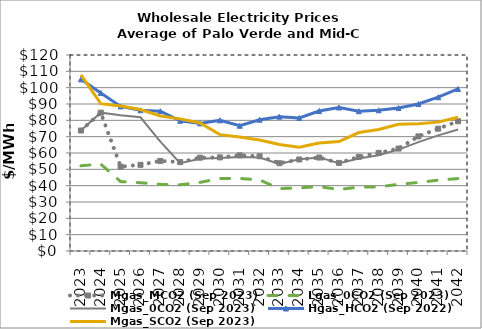
| Category | Mgas_MCO2 (Sep 2023) | Lgas_0CO2 (Sep 2023) | Mgas_0CO2 (Sep 2023) | Hgas_HCO2 (Sep 2022) | Mgas_SCO2 (Sep 2023) |
|---|---|---|---|---|---|
| 2023.0 | 73.772 | 52.194 | 73.772 | 105.104 | 107.803 |
| 2024.0 | 84.689 | 53.204 | 84.689 | 96.784 | 90.2 |
| 2025.0 | 51.628 | 42.478 | 83.128 | 88.513 | 88.716 |
| 2026.0 | 52.77 | 41.791 | 81.885 | 86.167 | 86.603 |
| 2027.0 | 55.173 | 40.802 | 66.917 | 85.587 | 82.665 |
| 2028.0 | 54.418 | 40.554 | 53.774 | 79.718 | 80.885 |
| 2029.0 | 57.141 | 42.017 | 56.475 | 78.139 | 78.404 |
| 2030.0 | 57.307 | 44.401 | 56.924 | 79.983 | 71.248 |
| 2031.0 | 58.564 | 44.431 | 57.595 | 76.682 | 69.765 |
| 2032.0 | 58.007 | 43.507 | 57.276 | 80.368 | 67.922 |
| 2033.0 | 53.726 | 38.199 | 53.259 | 82.237 | 65.226 |
| 2034.0 | 56.033 | 38.656 | 56.211 | 81.427 | 63.483 |
| 2035.0 | 57.225 | 39.413 | 57.312 | 85.699 | 66.133 |
| 2036.0 | 53.948 | 37.687 | 53.707 | 87.857 | 66.97 |
| 2037.0 | 57.619 | 39.095 | 56.673 | 85.583 | 72.526 |
| 2038.0 | 60.084 | 39.282 | 58.578 | 86.124 | 74.387 |
| 2039.0 | 62.709 | 40.803 | 62.105 | 87.514 | 77.609 |
| 2040.0 | 70.16 | 41.959 | 66.641 | 90.008 | 77.866 |
| 2041.0 | 74.909 | 43.363 | 70.808 | 94.161 | 78.904 |
| 2042.0 | 79.447 | 44.345 | 74.375 | 99.193 | 81.845 |